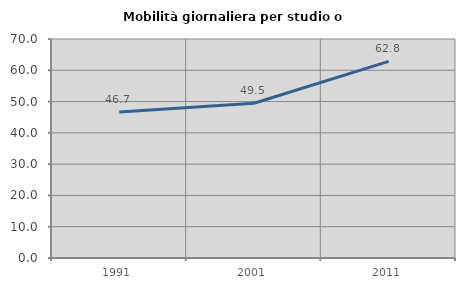
| Category | Mobilità giornaliera per studio o lavoro |
|---|---|
| 1991.0 | 46.685 |
| 2001.0 | 49.459 |
| 2011.0 | 62.83 |